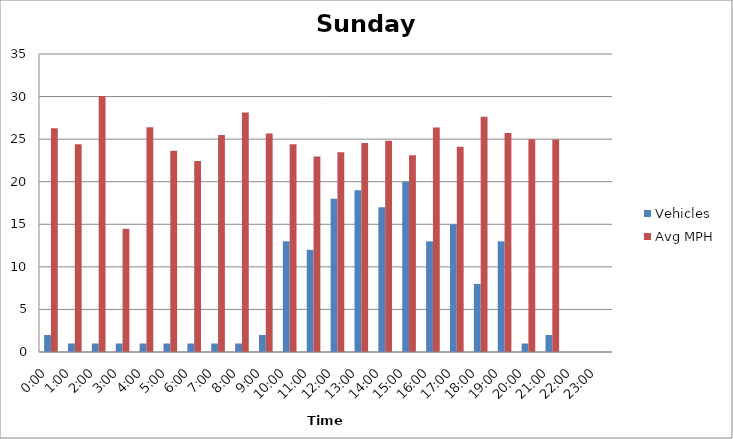
| Category | Vehicles | Avg MPH |
|---|---|---|
| 0:00 | 2 | 26.28 |
| 1:00 | 1 | 24.41 |
| 2:00 | 1 | 30.07 |
| 3:00 | 1 | 14.47 |
| 4:00 | 1 | 26.4 |
| 5:00 | 1 | 23.64 |
| 6:00 | 1 | 22.43 |
| 7:00 | 1 | 25.5 |
| 8:00 | 1 | 28.13 |
| 9:00 | 2 | 25.65 |
| 10:00 | 13 | 24.4 |
| 11:00 | 12 | 22.95 |
| 12:00 | 18 | 23.46 |
| 13:00 | 19 | 24.55 |
| 14:00 | 17 | 24.82 |
| 15:00 | 20 | 23.12 |
| 16:00 | 13 | 26.37 |
| 17:00 | 15 | 24.11 |
| 18:00 | 8 | 27.64 |
| 19:00 | 13 | 25.71 |
| 20:00 | 1 | 24.99 |
| 21:00 | 2 | 24.95 |
| 22:00 | 0 | 0 |
| 23:00 | 0 | 0 |